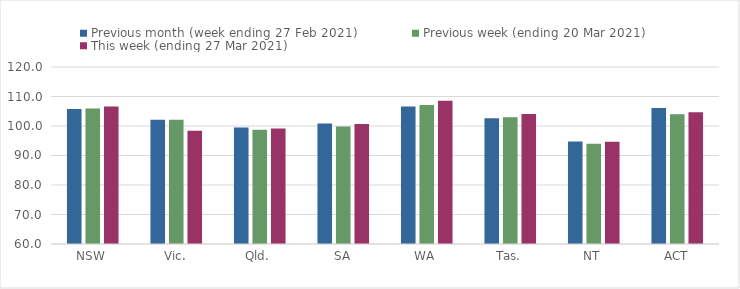
| Category | Previous month (week ending 27 Feb 2021) | Previous week (ending 20 Mar 2021) | This week (ending 27 Mar 2021) |
|---|---|---|---|
| NSW | 105.76 | 105.95 | 106.57 |
| Vic. | 102.09 | 102.13 | 98.4 |
| Qld. | 99.47 | 98.73 | 99.16 |
| SA | 100.83 | 99.79 | 100.69 |
| WA | 106.6 | 107.1 | 108.58 |
| Tas. | 102.66 | 102.97 | 104.1 |
| NT | 94.72 | 93.97 | 94.66 |
| ACT | 106.12 | 103.96 | 104.63 |